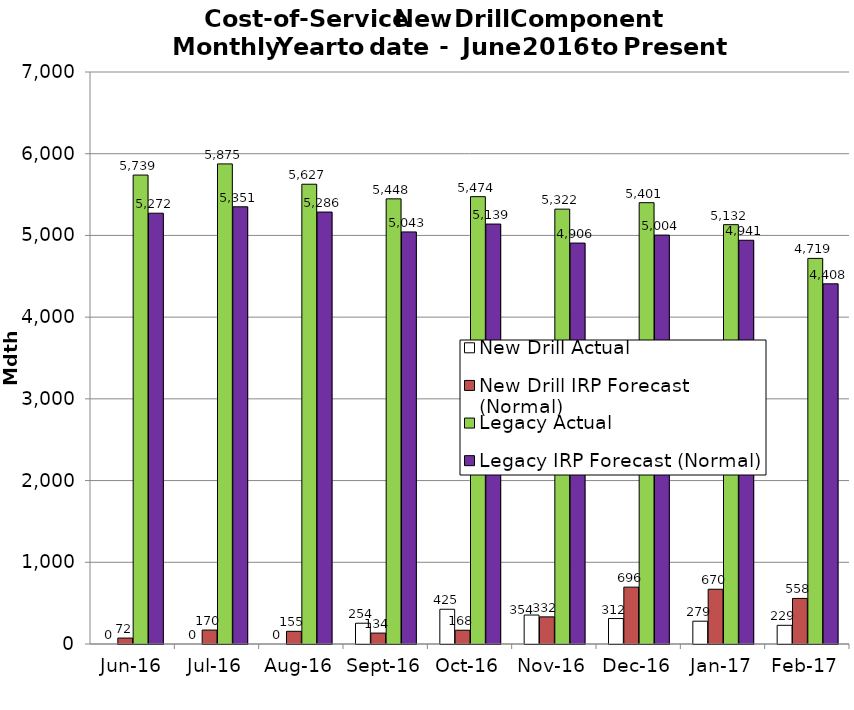
| Category | New Drill Actual | New Drill IRP Forecast (Normal) | Legacy Actual | Legacy IRP Forecast (Normal) |
|---|---|---|---|---|
| 2016-06-01 | 0 | 72.497 | 5738.91 | 5271.801 |
| 2016-07-01 | 0 | 170.406 | 5875.25 | 5350.528 |
| 2016-08-01 | 0 | 155.391 | 5626.69 | 5285.987 |
| 2016-09-01 | 254.13 | 133.566 | 5447.6 | 5042.742 |
| 2016-10-01 | 425.11 | 168.417 | 5474.47 | 5139.261 |
| 2016-11-01 | 354.41 | 332.007 | 5321.81 | 4906.425 |
| 2016-12-01 | 311.52 | 695.854 | 5400.85 | 5003.8 |
| 2017-01-01 | 278.99 | 670.208 | 5131.82 | 4940.634 |
| 2017-02-01 | 228.64 | 557.76 | 4718.83 | 4407.875 |